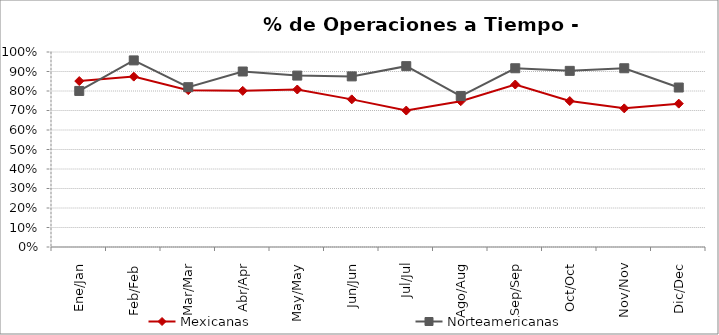
| Category | Mexicanas | Norteamericanas |
|---|---|---|
| Ene/Jan | 0.851 | 0.8 |
| Feb/Feb | 0.874 | 0.957 |
| Mar/Mar | 0.804 | 0.82 |
| Abr/Apr | 0.801 | 0.9 |
| May/May | 0.808 | 0.879 |
| Jun/Jun | 0.757 | 0.875 |
| Jul/Jul | 0.7 | 0.927 |
| Ago/Aug | 0.748 | 0.774 |
| Sep/Sep | 0.833 | 0.917 |
| Oct/Oct | 0.748 | 0.903 |
| Nov/Nov | 0.711 | 0.917 |
| Dic/Dec | 0.735 | 0.818 |